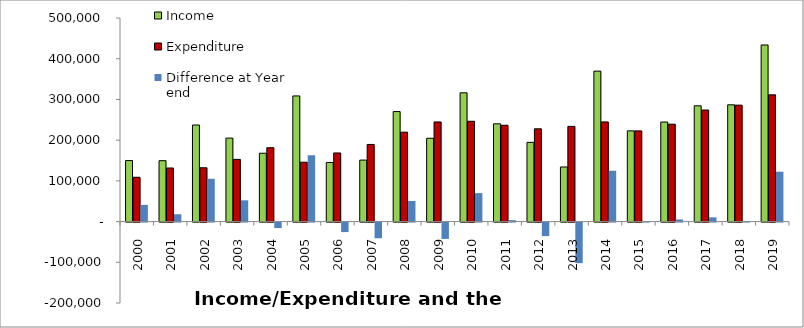
| Category | Income | Expenditure | Difference at Year end |
|---|---|---|---|
| 2000.0 | 149846 | 108812 | 41034 |
| 2001.0 | 149540 | 131561 | 17979 |
| 2002.0 | 237213 | 132133 | 105080 |
| 2003.0 | 204973 | 152756 | 52217 |
| 2004.0 | 167881 | 181405 | -13524 |
| 2005.0 | 308587 | 145778 | 162809 |
| 2006.0 | 145154 | 168508 | -23354 |
| 2007.0 | 151002 | 189444 | -38442 |
| 2008.0 | 270190 | 219579 | 50611 |
| 2009.0 | 204620 | 244688 | -40068 |
| 2010.0 | 316280 | 246354 | 69926 |
| 2011.0 | 240126 | 236548 | 3578 |
| 2012.0 | 194585 | 227866 | -33281 |
| 2013.0 | 134129 | 233803 | -99674 |
| 2014.0 | 369535 | 244725 | 124810 |
| 2015.0 | 222838 | 222739 | 99 |
| 2016.0 | 244489 | 239218 | 5271 |
| 2017.0 | 284350 | 273951 | 10399 |
| 2018.0 | 286766 | 285956 | 810 |
| 2019.0 | 433731 | 311246 | 122485 |